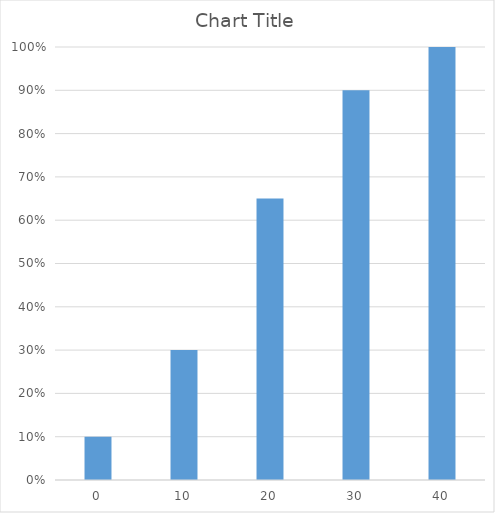
| Category | Series 0 |
|---|---|
| 0.0 | 0.1 |
| 10.0 | 0.3 |
| 20.0 | 0.65 |
| 30.0 | 0.9 |
| 40.0 | 1 |